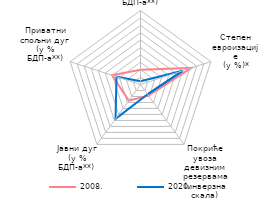
| Category | 2008. | 2020. |
|---|---|---|
| Текући дефицит платног биланса
(у % БДП-a**) | 20 | 4.3 |
| Степен
евроизације
(у %)* | 72.4 | 59.9 |
| Покриће увоза девизним резервама
(инверзна скала) | 18.651 | 16.3 |
| Јавни дуг
(у % БДП-a**) | 26.8 | 57.4 |
| Приватни
спољни дуг
(у % БДП-a**) | 40.4 | 34.1 |